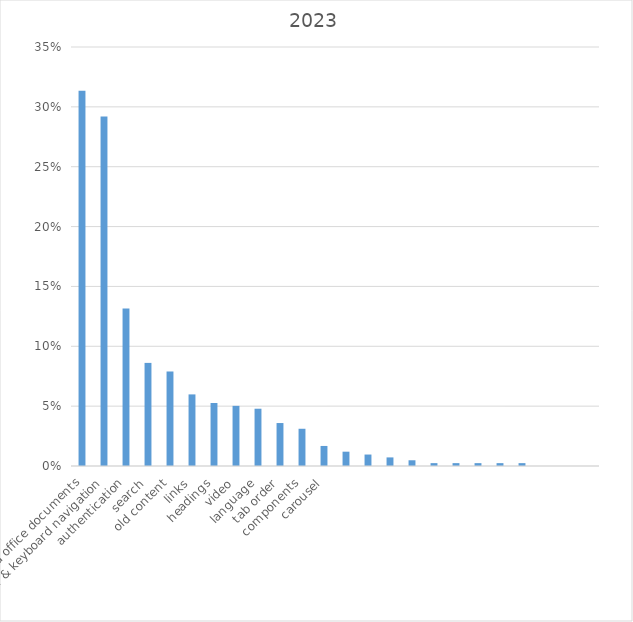
| Category | Series 0 |
|---|---|
| pdf and office documents | 0.313 |
| menu & keyboard navigation | 0.292 |
| authentication | 0.132 |
| search | 0.086 |
| old content | 0.079 |
| links | 0.06 |
| headings | 0.053 |
| video | 0.05 |
| language | 0.048 |
| tab order | 0.036 |
| components | 0.031 |
| carousel | 0.017 |